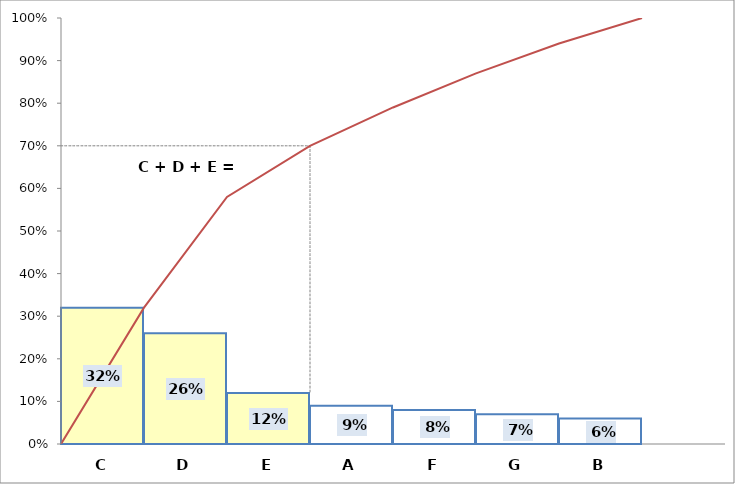
| Category | Säulen |
|---|---|
| C | 0.32 |
| D | 0.26 |
| E | 0.12 |
| A | 0.09 |
| F | 0.08 |
| G | 0.07 |
| B | 0.06 |